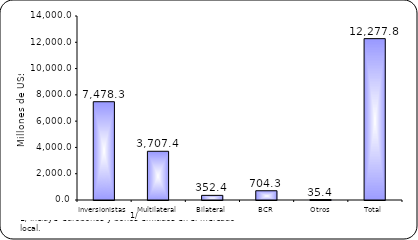
| Category | Series 1 |
|---|---|
| Inversionistas | 7478.3 |
| Multilateral | 3707.4 |
| Bilateral | 352.4 |
| BCR | 704.3 |
| Otros | 35.4 |
| Total | 12277.8 |